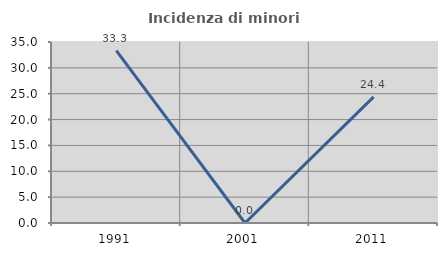
| Category | Incidenza di minori stranieri |
|---|---|
| 1991.0 | 33.333 |
| 2001.0 | 0 |
| 2011.0 | 24.39 |